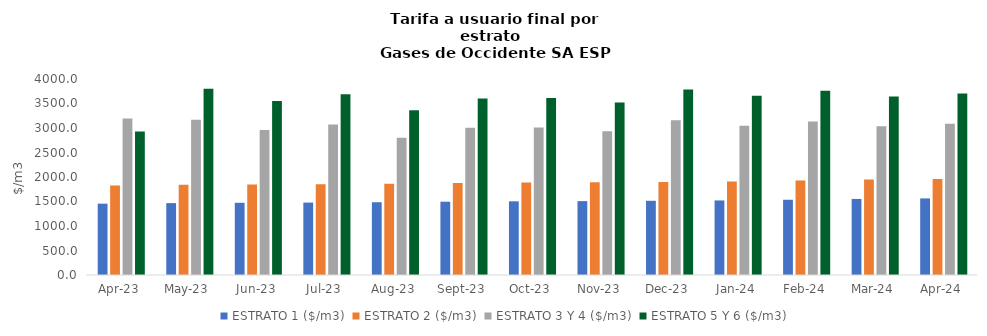
| Category | ESTRATO 1 ($/m3) | ESTRATO 2 ($/m3) | ESTRATO 3 Y 4 ($/m3) | ESTRATO 5 Y 6 ($/m3) |
|---|---|---|---|---|
| 2023-04-01 | 1455.91 | 1826.55 | 3194.1 | 2929.63 |
| 2023-05-01 | 1467.27 | 1840.8 | 3166.38 | 3799.656 |
| 2023-06-01 | 1473.58 | 1848.72 | 2958.7 | 3550.44 |
| 2023-07-01 | 1478 | 1854.26 | 3071.96 | 3686.352 |
| 2023-08-01 | 1485.39 | 1863.53 | 2800.92 | 3361.104 |
| 2023-09-01 | 1495.79 | 1876.58 | 3003.77 | 3604.524 |
| 2023-10-01 | 1503.86 | 1886.71 | 3011.88 | 3614.256 |
| 2023-11-01 | 1507.62 | 1891.43 | 2933.28 | 3519.936 |
| 2023-12-01 | 1514.69 | 1900.29 | 3156.1 | 3787.32 |
| 2024-01-01 | 1521.53 | 1908.87 | 3048.21 | 3657.852 |
| 2024-02-01 | 1535.52 | 1926.43 | 3133.79 | 3760.548 |
| 2024-03-01 | 1552.26 | 1947.43 | 3037.71 | 3645.252 |
| 2024-04-01 | 1563.13 | 1961.06 | 3088.17 | 3705.804 |